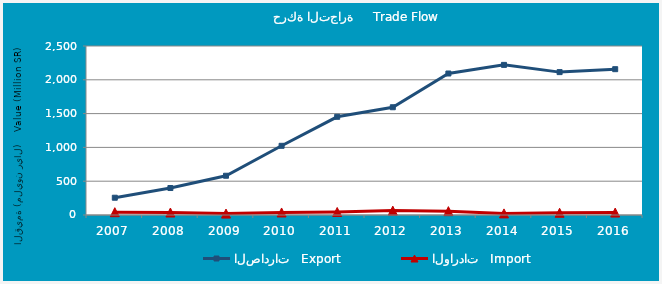
| Category | الصادرات   Export | الواردات   Import |
|---|---|---|
| 2007.0 | 255.601 | 41.519 |
| 2008.0 | 399.094 | 36.934 |
| 2009.0 | 580.675 | 21.014 |
| 2010.0 | 1023.713 | 37.372 |
| 2011.0 | 1452.707 | 44.678 |
| 2012.0 | 1594.041 | 64.802 |
| 2013.0 | 2093.15 | 57.184 |
| 2014.0 | 2220.646 | 23.755 |
| 2015.0 | 2113.694 | 33.077 |
| 2016.0 | 2157.029 | 35.941 |